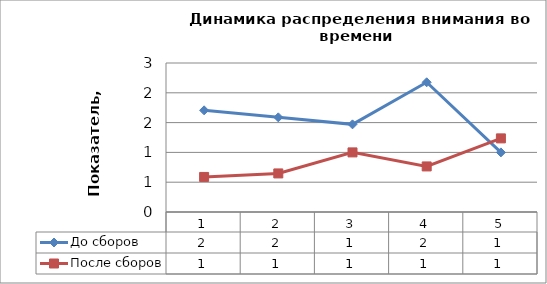
| Category | До сборов | После сборов |
|---|---|---|
| 0 | 1.706 | 0.588 |
| 1 | 1.588 | 0.647 |
| 2 | 1.471 | 1 |
| 3 | 2.176 | 0.765 |
| 4 | 1 | 1.235 |